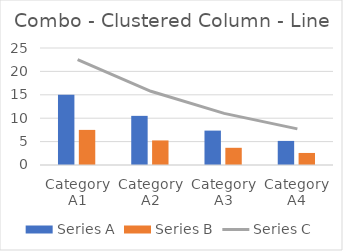
| Category | Series A | Series B |
|---|---|---|
| Category A1 | 15 | 7.5 |
| Category A2 | 10.5 | 5.25 |
| Category A3 | 7.35 | 3.675 |
| Category A4 | 5.145 | 2.572 |